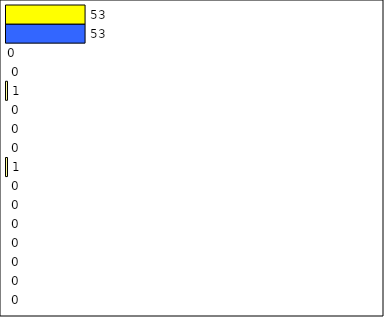
| Category | -2 | -1 | 0 | 1 | 2 | 3 | 4 | 5 | 6 | 7 | 8 | 9 | 10 | 11 | 12 | Perfect Round |
|---|---|---|---|---|---|---|---|---|---|---|---|---|---|---|---|---|
| 0 | 0 | 0 | 0 | 0 | 0 | 0 | 0 | 1 | 0 | 0 | 0 | 1 | 0 | 0 | 53 | 53 |